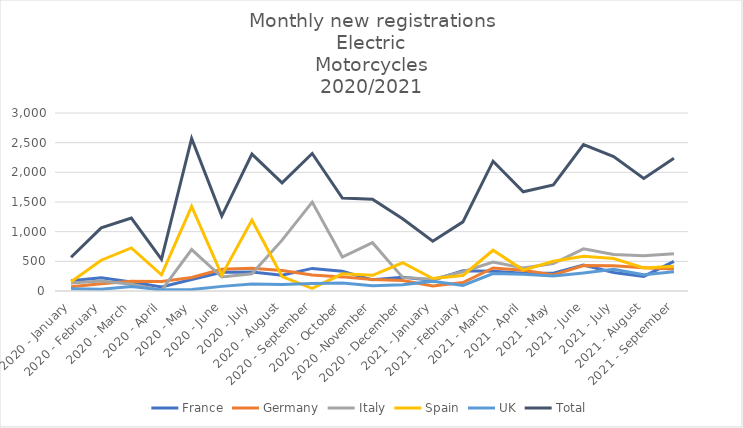
| Category | France | Germany | Italy | Spain | UK | Total |
|---|---|---|---|---|---|---|
| 2020 - January | 172 | 70 | 135 | 155 | 36 | 568 |
| 2020 - February | 225 | 124 | 167 | 519 | 30 | 1065 |
| 2020 - March | 151 | 166 | 112 | 725 | 75 | 1229 |
| 2020 - April | 68 | 162 | 12 | 273 | 19 | 534 |
| 2020 - May | 195 | 228 | 699 | 1425 | 24 | 2571 |
| 2020 - June | 317 | 367 | 235 | 266 | 78 | 1263 |
| 2020 - July | 320 | 384 | 290 | 1196 | 117 | 2307 |
| 2020 - August | 266 | 346 | 857 | 244 | 109 | 1822 |
| 2020 - September | 381 | 268 | 1498 | 44 | 127 | 2318 |
| 2020 - October | 333 | 238 | 572 | 290 | 133 | 1566 |
| 2020 -November | 188 | 193 | 814 | 264 | 89 | 1548 |
| 2020 - December | 231 | 176 | 229 | 476 | 104 | 1216 |
| 2021 - January | 183 | 83 | 197 | 211 | 164 | 838 |
| 2021 - February | 341 | 143 | 325 | 262 | 94 | 1165 |
| 2021 - March | 331 | 388 | 487 | 687 | 295 | 2188 |
| 2021 - April | 301 | 349 | 389 | 352 | 282 | 1673 |
| 2021 - May | 299 | 270 | 463 | 502 | 254 | 1788 |
| 2021 - June | 439 | 429 | 711 | 584 | 305 | 2468 |
| 2021 - July | 312 | 426 | 616 | 546 | 365 | 2265 |
| 2021 - August | 245 | 392 | 596 | 389 | 275 | 1897 |
| 2021 - September | 499 | 369 | 628 | 419 | 324 | 2239 |